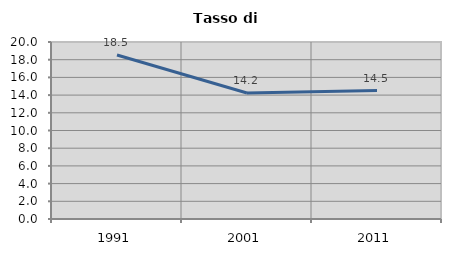
| Category | Tasso di disoccupazione   |
|---|---|
| 1991.0 | 18.531 |
| 2001.0 | 14.236 |
| 2011.0 | 14.514 |